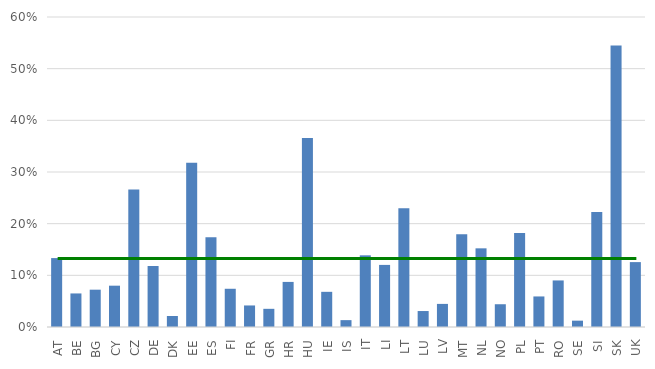
| Category | Series 0 |
|---|---|
| AT | 0.133 |
| BE | 0.065 |
| BG | 0.072 |
| CY | 0.08 |
| CZ | 0.266 |
| DE | 0.118 |
| DK | 0.021 |
| EE | 0.318 |
| ES | 0.174 |
| FI | 0.074 |
| FR | 0.042 |
| GR | 0.035 |
| HR | 0.087 |
| HU | 0.366 |
| IE | 0.068 |
| IS | 0.013 |
| IT | 0.139 |
| LI | 0.12 |
| LT | 0.23 |
| LU | 0.031 |
| LV | 0.045 |
| MT | 0.179 |
| NL | 0.152 |
| NO | 0.044 |
| PL | 0.182 |
| PT | 0.059 |
| RO | 0.09 |
| SE | 0.012 |
| SI | 0.223 |
| SK | 0.545 |
| UK | 0.126 |